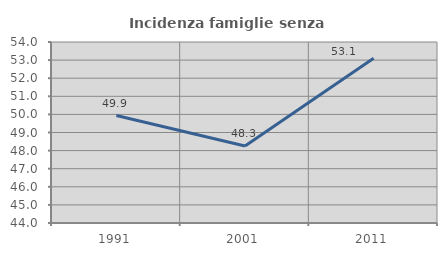
| Category | Incidenza famiglie senza nuclei |
|---|---|
| 1991.0 | 49.936 |
| 2001.0 | 48.254 |
| 2011.0 | 53.103 |